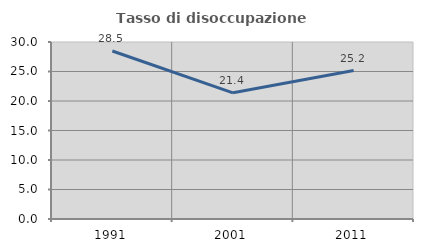
| Category | Tasso di disoccupazione giovanile  |
|---|---|
| 1991.0 | 28.471 |
| 2001.0 | 21.389 |
| 2011.0 | 25.157 |